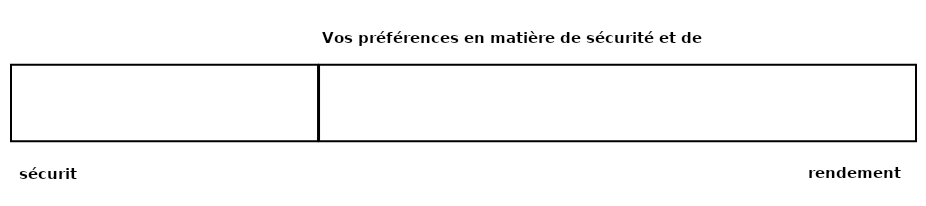
| Category | voorkeur klant | Series 0 |
|---|---|---|
| 0 | 85 | 165 |